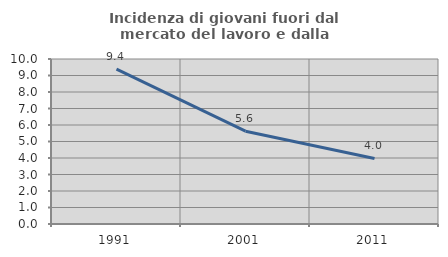
| Category | Incidenza di giovani fuori dal mercato del lavoro e dalla formazione  |
|---|---|
| 1991.0 | 9.39 |
| 2001.0 | 5.626 |
| 2011.0 | 3.97 |